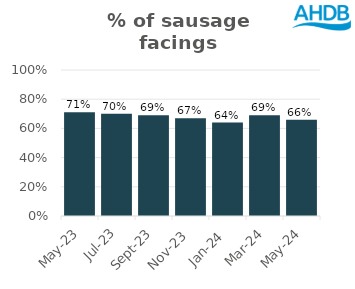
| Category | Sausage |
|---|---|
| 2023-05-01 | 0.71 |
| 2023-07-01 | 0.7 |
| 2023-09-01 | 0.69 |
| 2023-11-01 | 0.67 |
| 2024-01-01 | 0.64 |
| 2024-03-01 | 0.69 |
| 2024-05-01 | 0.66 |